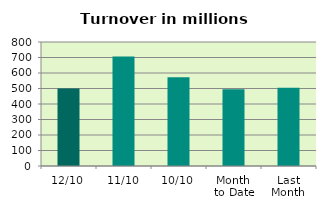
| Category | Series 0 |
|---|---|
| 12/10 | 500.355 |
| 11/10 | 706.215 |
| 10/10 | 573.161 |
| Month 
to Date | 495.494 |
| Last
Month | 505.274 |